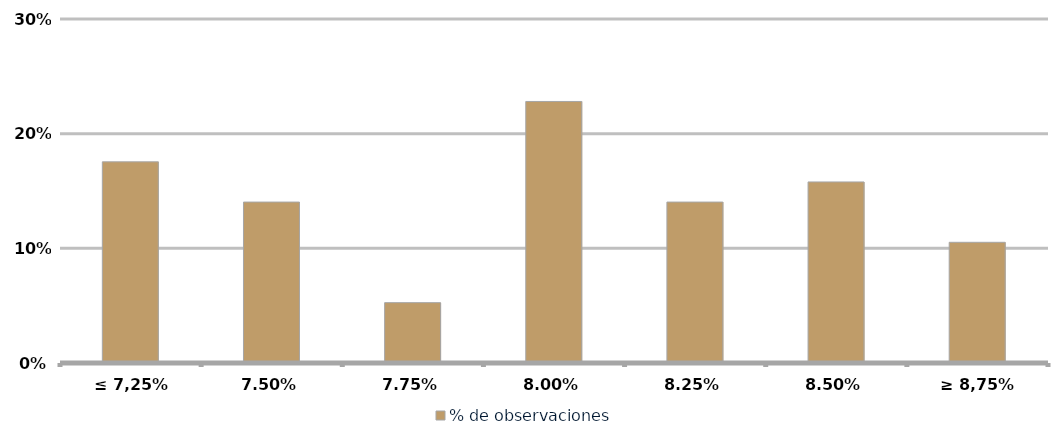
| Category | % de observaciones  |
|---|---|
| ≤ 7,25% | 0.175 |
| 7,50% | 0.14 |
| 7,75% | 0.053 |
| 8,00% | 0.228 |
| 8,25% | 0.14 |
| 8,50% | 0.158 |
| ≥ 8,75% | 0.105 |